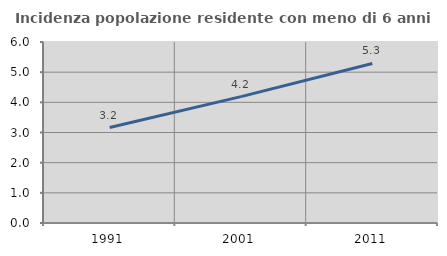
| Category | Incidenza popolazione residente con meno di 6 anni |
|---|---|
| 1991.0 | 3.165 |
| 2001.0 | 4.188 |
| 2011.0 | 5.288 |